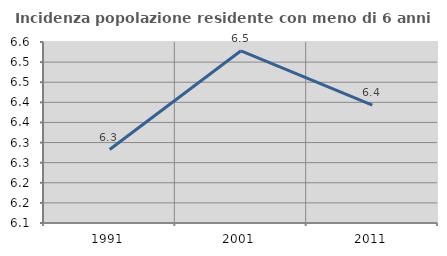
| Category | Incidenza popolazione residente con meno di 6 anni |
|---|---|
| 1991.0 | 6.283 |
| 2001.0 | 6.528 |
| 2011.0 | 6.393 |